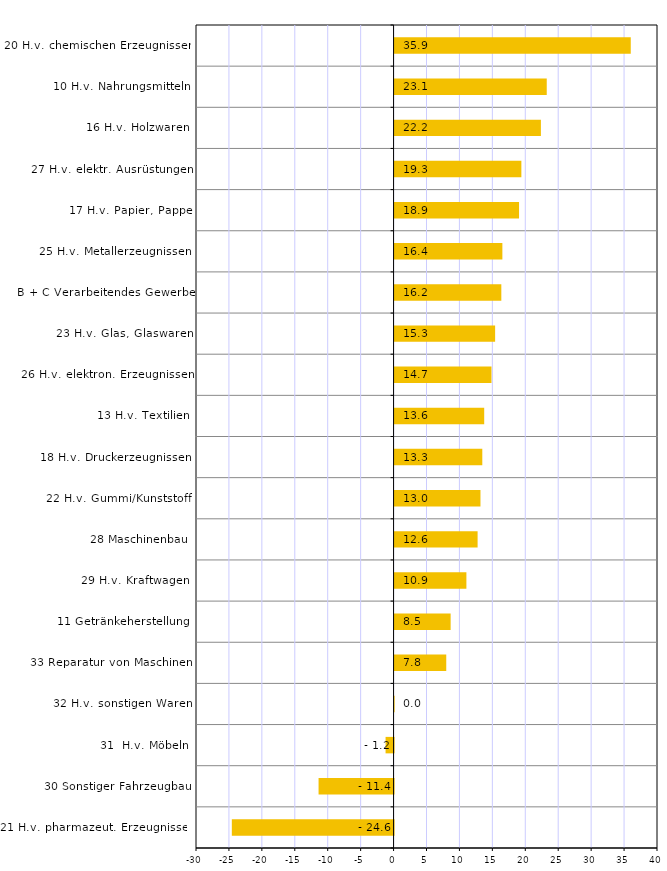
| Category | Series 0 |
|---|---|
| 21 H.v. pharmazeut. Erzeugnissen | -24.56 |
| 30 Sonstiger Fahrzeugbau | -11.388 |
| 31  H.v. Möbeln | -1.215 |
| 32 H.v. sonstigen Waren | 0.005 |
| 33 Reparatur von Maschinen | 7.847 |
| 11 Getränkeherstellung | 8.512 |
| 29 H.v. Kraftwagen | 10.906 |
| 28 Maschinenbau | 12.607 |
| 22 H.v. Gummi/Kunststoff | 13.042 |
| 18 H.v. Druckerzeugnissen | 13.321 |
| 13 H.v. Textilien | 13.61 |
| 26 H.v. elektron. Erzeugnissen | 14.714 |
| 23 H.v. Glas, Glaswaren | 15.269 |
| B + C Verarbeitendes Gewerbe | 16.21 |
| 25 H.v. Metallerzeugnissen | 16.368 |
| 17 H.v. Papier, Pappe | 18.901 |
| 27 H.v. elektr. Ausrüstungen | 19.253 |
| 16 H.v. Holzwaren | 22.219 |
| 10 H.v. Nahrungsmitteln | 23.107 |
| 20 H.v. chemischen Erzeugnissen | 35.863 |